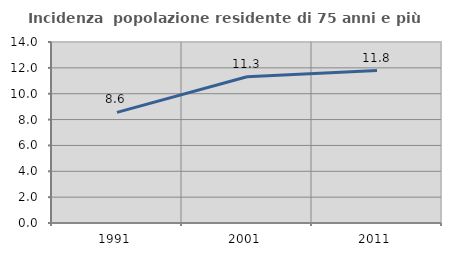
| Category | Incidenza  popolazione residente di 75 anni e più |
|---|---|
| 1991.0 | 8.556 |
| 2001.0 | 11.315 |
| 2011.0 | 11.792 |